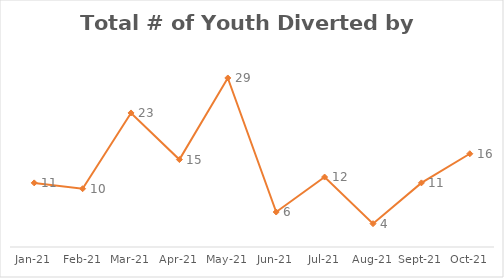
| Category | Series 0 |
|---|---|
| 2021-01-01 | 11 |
| 2021-02-01 | 10 |
| 2021-03-01 | 23 |
| 2021-04-01 | 15 |
| 2021-05-01 | 29 |
| 2021-06-01 | 6 |
| 2021-07-01 | 12 |
| 2021-08-01 | 4 |
| 2021-09-01 | 11 |
| 2021-10-01 | 16 |